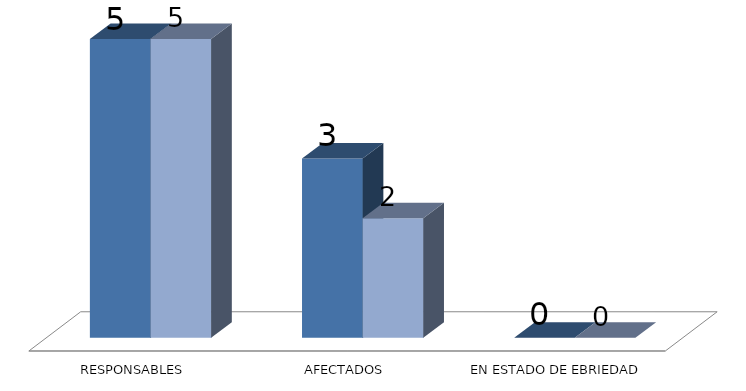
| Category | Series 0 | Series 1 |
|---|---|---|
| RESPONSABLES | 5 | 5 |
| AFECTADOS | 3 | 2 |
| EN ESTADO DE EBRIEDAD | 0 | 0 |